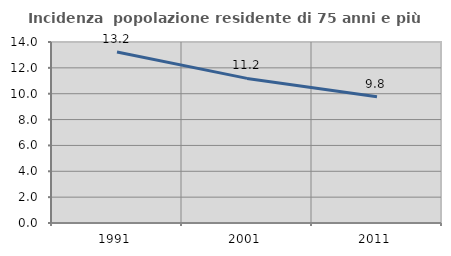
| Category | Incidenza  popolazione residente di 75 anni e più |
|---|---|
| 1991.0 | 13.226 |
| 2001.0 | 11.184 |
| 2011.0 | 9.761 |